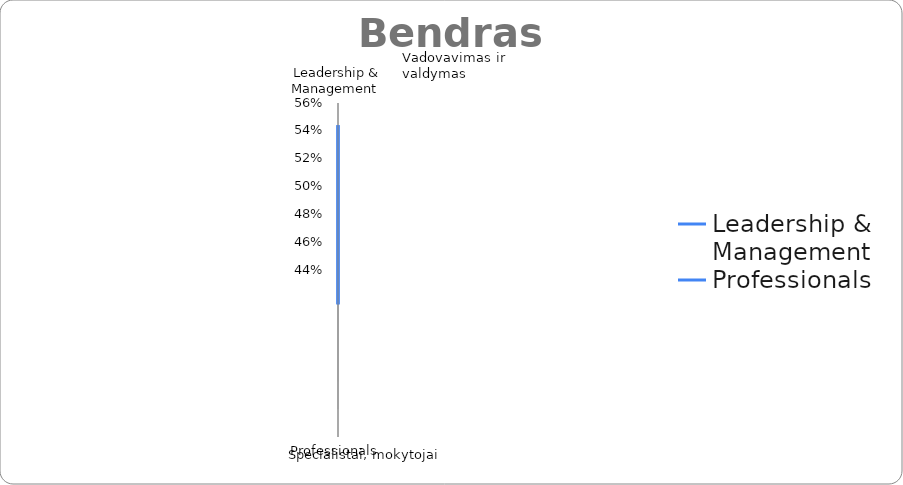
| Category | Series 0 |
|---|---|
| Leadership & Management  | 0.544 |
| Professionals  | 0.465 |